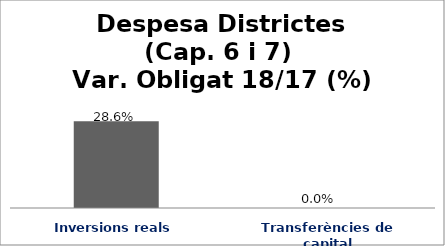
| Category | Series 0 |
|---|---|
| Inversions reals | 0.286 |
| Transferències de capital | 0 |